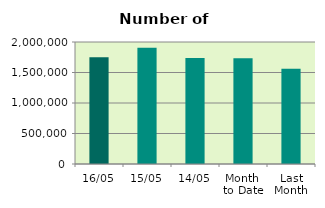
| Category | Series 0 |
|---|---|
| 16/05 | 1751882 |
| 15/05 | 1904626 |
| 14/05 | 1738574 |
| Month 
to Date | 1732942.364 |
| Last
Month | 1561575.6 |